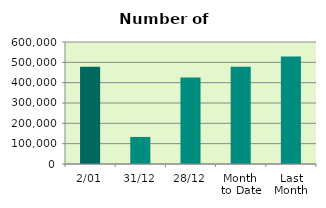
| Category | Series 0 |
|---|---|
| 2/01 | 477696 |
| 31/12 | 133062 |
| 28/12 | 425204 |
| Month 
to Date | 477696 |
| Last
Month | 528134.632 |